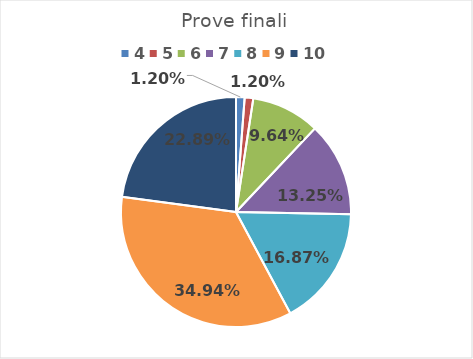
| Category | Series 0 |
|---|---|
| 4.0 | 0.012 |
| 5.0 | 0.012 |
| 6.0 | 0.096 |
| 7.0 | 0.133 |
| 8.0 | 0.169 |
| 9.0 | 0.349 |
| 10.0 | 0.229 |